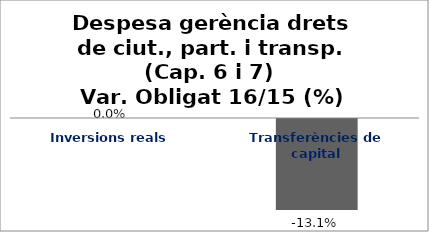
| Category | Series 0 |
|---|---|
| Inversions reals | 0 |
| Transferències de capital | -0.131 |